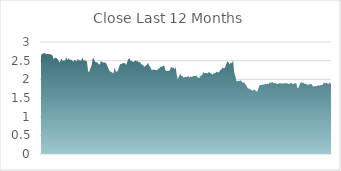
| Category | Series 0 |
|---|---|
| 2020-12-22 | 2.65 |
| 2020-12-23 | 2.68 |
| 2020-12-24 | 2.69 |
| 2020-12-29 | 2.71 |
| 2020-12-30 | 2.69 |
| 2020-12-31 | 2.67 |
| 2021-01-04 | 2.69 |
| 2021-01-05 | 2.67 |
| 2021-01-06 | 2.67 |
| 2021-01-07 | 2.66 |
| 2021-01-08 | 2.64 |
| 2021-01-11 | 2.53 |
| 2021-01-12 | 2.58 |
| 2021-01-13 | 2.58 |
| 2021-01-14 | 2.55 |
| 2021-01-15 | 2.52 |
| 2021-01-18 | 2.45 |
| 2021-01-19 | 2.5 |
| 2021-01-20 | 2.56 |
| 2021-01-21 | 2.49 |
| 2021-01-22 | 2.5 |
| 2021-01-25 | 2.51 |
| 2021-01-27 | 2.59 |
| 2021-01-28 | 2.51 |
| 2021-01-29 | 2.57 |
| 2021-02-01 | 2.52 |
| 2021-02-02 | 2.53 |
| 2021-02-03 | 2.51 |
| 2021-02-04 | 2.47 |
| 2021-02-05 | 2.52 |
| 2021-02-08 | 2.51 |
| 2021-02-09 | 2.48 |
| 2021-02-10 | 2.55 |
| 2021-02-11 | 2.51 |
| 2021-02-12 | 2.5 |
| 2021-02-15 | 2.51 |
| 2021-02-16 | 2.58 |
| 2021-02-17 | 2.5 |
| 2021-02-18 | 2.51 |
| 2021-02-19 | 2.5 |
| 2021-02-22 | 2.47 |
| 2021-02-23 | 2.2 |
| 2021-02-24 | 2.21 |
| 2021-02-25 | 2.3 |
| 2021-02-26 | 2.37 |
| 2021-03-01 | 2.57 |
| 2021-03-02 | 2.55 |
| 2021-03-03 | 2.47 |
| 2021-03-04 | 2.46 |
| 2021-03-05 | 2.45 |
| 2021-03-08 | 2.41 |
| 2021-03-09 | 2.39 |
| 2021-03-10 | 2.49 |
| 2021-03-11 | 2.47 |
| 2021-03-12 | 2.45 |
| 2021-03-15 | 2.45 |
| 2021-03-16 | 2.45 |
| 2021-03-17 | 2.41 |
| 2021-03-18 | 2.34 |
| 2021-03-19 | 2.26 |
| 2021-03-22 | 2.21 |
| 2021-03-23 | 2.2 |
| 2021-03-24 | 2.18 |
| 2021-03-25 | 2.16 |
| 2021-03-26 | 2.32 |
| 2021-03-29 | 2.21 |
| 2021-03-30 | 2.2 |
| 2021-03-31 | 2.24 |
| 2021-04-01 | 2.35 |
| 2021-04-06 | 2.41 |
| 2021-04-07 | 2.41 |
| 2021-04-08 | 2.43 |
| 2021-04-09 | 2.44 |
| 2021-04-12 | 2.43 |
| 2021-04-13 | 2.38 |
| 2021-04-14 | 2.47 |
| 2021-04-15 | 2.55 |
| 2021-04-16 | 2.56 |
| 2021-04-19 | 2.49 |
| 2021-04-20 | 2.5 |
| 2021-04-21 | 2.46 |
| 2021-04-22 | 2.48 |
| 2021-04-23 | 2.51 |
| 2021-04-26 | 2.48 |
| 2021-04-27 | 2.49 |
| 2021-04-28 | 2.45 |
| 2021-04-29 | 2.47 |
| 2021-04-30 | 2.41 |
| 2021-05-03 | 2.39 |
| 2021-05-04 | 2.37 |
| 2021-05-05 | 2.33 |
| 2021-05-06 | 2.37 |
| 2021-05-07 | 2.39 |
| 2021-05-10 | 2.44 |
| 2021-05-11 | 2.37 |
| 2021-05-12 | 2.33 |
| 2021-05-13 | 2.26 |
| 2021-05-14 | 2.25 |
| 2021-05-17 | 2.27 |
| 2021-05-18 | 2.25 |
| 2021-05-19 | 2.25 |
| 2021-05-20 | 2.24 |
| 2021-05-21 | 2.28 |
| 2021-05-24 | 2.3 |
| 2021-05-25 | 2.34 |
| 2021-05-26 | 2.34 |
| 2021-05-27 | 2.35 |
| 2021-05-28 | 2.38 |
| 2021-05-31 | 2.26 |
| 2021-06-01 | 2.22 |
| 2021-06-02 | 2.22 |
| 2021-06-03 | 2.23 |
| 2021-06-04 | 2.24 |
| 2021-06-07 | 2.33 |
| 2021-06-08 | 2.31 |
| 2021-06-09 | 2.32 |
| 2021-06-10 | 2.27 |
| 2021-06-11 | 2.33 |
| 2021-06-15 | 2.12 |
| 2021-06-16 | 2 |
| 2021-06-17 | 2.09 |
| 2021-06-18 | 2.14 |
| 2021-06-21 | 2.09 |
| 2021-06-22 | 2.09 |
| 2021-06-23 | 2.04 |
| 2021-06-24 | 2.06 |
| 2021-06-25 | 2.06 |
| 2021-06-28 | 2.06 |
| 2021-06-29 | 2.09 |
| 2021-06-30 | 2.05 |
| 2021-07-01 | 2.08 |
| 2021-07-02 | 2.06 |
| 2021-07-05 | 2.08 |
| 2021-07-06 | 2.09 |
| 2021-07-07 | 2.09 |
| 2021-07-08 | 2.11 |
| 2021-07-09 | 2.05 |
| 2021-07-12 | 2.04 |
| 2021-07-13 | 2.05 |
| 2021-07-14 | 2.11 |
| 2021-07-15 | 2.1 |
| 2021-07-16 | 2.19 |
| 2021-07-19 | 2.17 |
| 2021-07-20 | 2.17 |
| 2021-07-21 | 2.17 |
| 2021-07-22 | 2.16 |
| 2021-07-23 | 2.2 |
| 2021-07-26 | 2.17 |
| 2021-07-27 | 2.16 |
| 2021-07-28 | 2.12 |
| 2021-07-29 | 2.16 |
| 2021-07-30 | 2.16 |
| 2021-08-02 | 2.18 |
| 2021-08-03 | 2.21 |
| 2021-08-04 | 2.18 |
| 2021-08-05 | 2.2 |
| 2021-08-06 | 2.25 |
| 2021-08-09 | 2.27 |
| 2021-08-10 | 2.32 |
| 2021-08-11 | 2.29 |
| 2021-08-12 | 2.32 |
| 2021-08-13 | 2.4 |
| 2021-08-16 | 2.48 |
| 2021-08-17 | 2.46 |
| 2021-08-18 | 2.4 |
| 2021-08-19 | 2.46 |
| 2021-08-20 | 2.42 |
| 2021-08-23 | 2.51 |
| 2021-08-24 | 2.18 |
| 2021-08-25 | 2.08 |
| 2021-08-26 | 1.95 |
| 2021-08-27 | 1.95 |
| 2021-08-30 | 1.965 |
| 2021-08-31 | 1.955 |
| 2021-09-01 | 1.975 |
| 2021-09-02 | 1.915 |
| 2021-09-03 | 1.915 |
| 2021-09-06 | 1.905 |
| 2021-09-07 | 1.855 |
| 2021-09-08 | 1.81 |
| 2021-09-09 | 1.745 |
| 2021-09-10 | 1.76 |
| 2021-09-13 | 1.73 |
| 2021-09-14 | 1.72 |
| 2021-09-15 | 1.685 |
| 2021-09-16 | 1.73 |
| 2021-09-17 | 1.715 |
| 2021-09-20 | 1.68 |
| 2021-09-21 | 1.675 |
| 2021-09-22 | 1.76 |
| 2021-09-23 | 1.845 |
| 2021-09-24 | 1.85 |
| 2021-09-27 | 1.845 |
| 2021-09-28 | 1.86 |
| 2021-09-29 | 1.86 |
| 2021-09-30 | 1.88 |
| 2021-10-01 | 1.87 |
| 2021-10-04 | 1.89 |
| 2021-10-05 | 1.87 |
| 2021-10-06 | 1.93 |
| 2021-10-07 | 1.9 |
| 2021-10-08 | 1.93 |
| 2021-10-11 | 1.905 |
| 2021-10-12 | 1.895 |
| 2021-10-13 | 1.9 |
| 2021-10-14 | 1.875 |
| 2021-10-15 | 1.88 |
| 2021-10-18 | 1.895 |
| 2021-10-19 | 1.885 |
| 2021-10-20 | 1.9 |
| 2021-10-21 | 1.88 |
| 2021-10-22 | 1.895 |
| 2021-10-25 | 1.895 |
| 2021-10-26 | 1.895 |
| 2021-10-27 | 1.895 |
| 2021-10-28 | 1.875 |
| 2021-10-29 | 1.88 |
| 2021-11-01 | 1.9 |
| 2021-11-02 | 1.9 |
| 2021-11-03 | 1.87 |
| 2021-11-04 | 1.89 |
| 2021-11-05 | 1.895 |
| 2021-11-08 | 1.89 |
| 2021-11-09 | 1.765 |
| 2021-11-10 | 1.78 |
| 2021-11-11 | 1.875 |
| 2021-11-12 | 1.92 |
| 2021-11-15 | 1.91 |
| 2021-11-16 | 1.91 |
| 2021-11-17 | 1.88 |
| 2021-11-18 | 1.885 |
| 2021-11-19 | 1.865 |
| 2021-11-22 | 1.855 |
| 2021-11-23 | 1.855 |
| 2021-11-24 | 1.88 |
| 2021-11-25 | 1.875 |
| 2021-11-26 | 1.835 |
| 2021-11-29 | 1.8 |
| 2021-11-30 | 1.825 |
| 2021-12-01 | 1.82 |
| 2021-12-02 | 1.825 |
| 2021-12-03 | 1.845 |
| 2021-12-06 | 1.83 |
| 2021-12-07 | 1.845 |
| 2021-12-08 | 1.85 |
| 2021-12-09 | 1.855 |
| 2021-12-10 | 1.92 |
| 2021-12-13 | 1.89 |
| 2021-12-14 | 1.915 |
| 2021-12-15 | 1.885 |
| 2021-12-16 | 1.875 |
| 2021-12-17 | 1.92 |
| 2021-12-20 | 1.88 |
| 2021-12-21 | 1.88 |